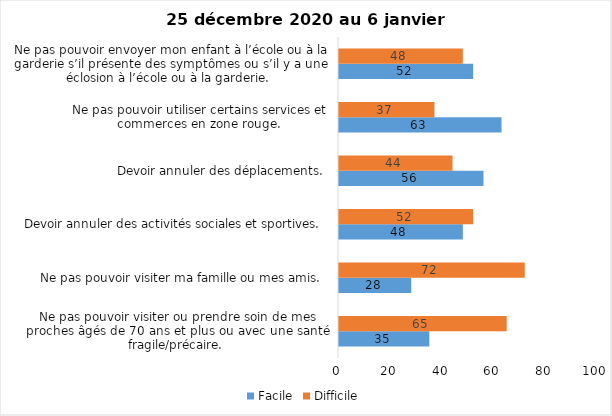
| Category | Facile | Difficile |
|---|---|---|
| Ne pas pouvoir visiter ou prendre soin de mes proches âgés de 70 ans et plus ou avec une santé fragile/précaire.  | 35 | 65 |
| Ne pas pouvoir visiter ma famille ou mes amis.  | 28 | 72 |
| Devoir annuler des activités sociales et sportives.  | 48 | 52 |
| Devoir annuler des déplacements.  | 56 | 44 |
| Ne pas pouvoir utiliser certains services et commerces en zone rouge.  | 63 | 37 |
| Ne pas pouvoir envoyer mon enfant à l’école ou à la garderie s’il présente des symptômes ou s’il y a une éclosion à l’école ou à la garderie.  | 52 | 48 |